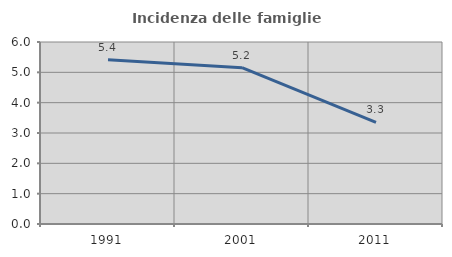
| Category | Incidenza delle famiglie numerose |
|---|---|
| 1991.0 | 5.419 |
| 2001.0 | 5.155 |
| 2011.0 | 3.349 |